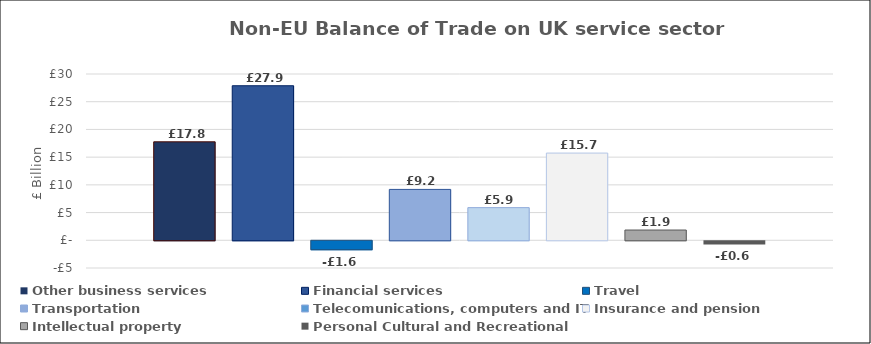
| Category |  Other business services  |  Financial services  |  Travel  |  Transportation  |  Telecomunications, computers and IT  |  Insurance and pension  |  Intellectual property  |  Personal Cultural and Recreational  |
|---|---|---|---|---|---|---|---|---|
| 0 | 17.765 | 27.882 | -1.618 | 9.178 | 5.892 | 15.734 | 1.852 | -0.574 |